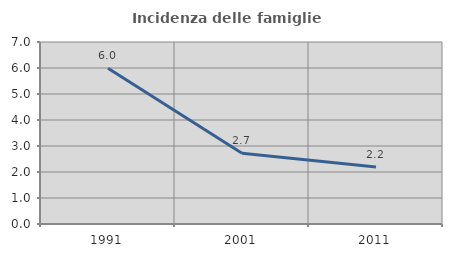
| Category | Incidenza delle famiglie numerose |
|---|---|
| 1991.0 | 5.99 |
| 2001.0 | 2.719 |
| 2011.0 | 2.197 |